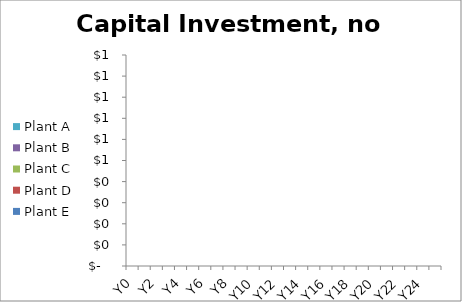
| Category | Plant E | Plant D | Plant C | Plant B | Plant A |
|---|---|---|---|---|---|
| Y0 | 0 | 0 | 0 | 0 | 0 |
| Y1 | 0 | 0 | 0 | 0 | 0 |
| Y2 | 0 | 0 | 0 | 0 | 0 |
| Y3 | 0 | 0 | 0 | 0 | 0 |
| Y4 | 0 | 0 | 0 | 0 | 0 |
| Y5 | 0 | 0 | 0 | 0 | 0 |
| Y6 | 0 | 0 | 0 | 0 | 0 |
| Y7 | 0 | 0 | 0 | 0 | 0 |
| Y8 | 0 | 0 | 0 | 0 | 0 |
| Y9 | 0 | 0 | 0 | 0 | 0 |
| Y10 | 0 | 0 | 0 | 0 | 0 |
| Y11 | 0 | 0 | 0 | 0 | 0 |
| Y12 | 0 | 0 | 0 | 0 | 0 |
| Y13 | 0 | 0 | 0 | 0 | 0 |
| Y14 | 0 | 0 | 0 | 0 | 0 |
| Y15 | 0 | 0 | 0 | 0 | 0 |
| Y16 | 0 | 0 | 0 | 0 | 0 |
| Y17 | 0 | 0 | 0 | 0 | 0 |
| Y18 | 0 | 0 | 0 | 0 | 0 |
| Y19 | 0 | 0 | 0 | 0 | 0 |
| Y20 | 0 | 0 | 0 | 0 | 0 |
| Y21 | 0 | 0 | 0 | 0 | 0 |
| Y22 | 0 | 0 | 0 | 0 | 0 |
| Y23 | 0 | 0 | 0 | 0 | 0 |
| Y24 | 0 | 0 | 0 | 0 | 0 |
| Y25 | 0 | 0 | 0 | 0 | 0 |